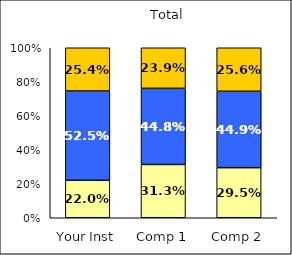
| Category | Low Institutional Priority: Civic Engagement | Average Institutional Priority: Civic Engagement | High Institutional Priority: Civic Engagement |
|---|---|---|---|
| Your Inst | 0.22 | 0.525 | 0.254 |
| Comp 1 | 0.313 | 0.448 | 0.239 |
| Comp 2 | 0.295 | 0.449 | 0.256 |